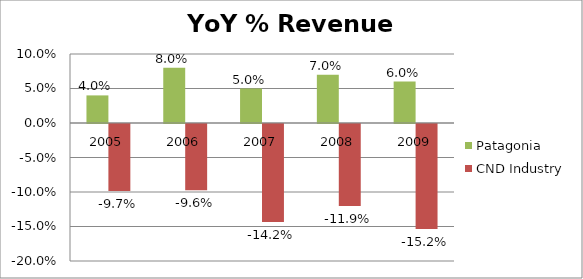
| Category | Patagonia | CND Industry |
|---|---|---|
| 2005.0 | 0.04 | -0.097 |
| 2006.0 | 0.08 | -0.096 |
| 2007.0 | 0.05 | -0.142 |
| 2008.0 | 0.07 | -0.119 |
| 2009.0 | 0.06 | -0.152 |